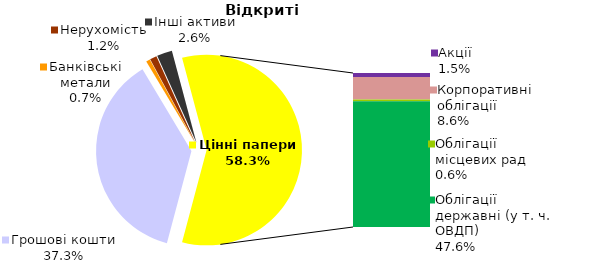
| Category | Відкриті |
|---|---|
| Грошові кошти | 819.275 |
| Банківські метали | 14.73 |
| Нерухомість | 25.604 |
| Інші активи | 57.035 |
| Акції | 32.941 |
| Корпоративні облігації | 188.148 |
| Облігації місцевих рад | 13.436 |
| Облігації державні (у т. ч. ОВДП) | 1046.837 |